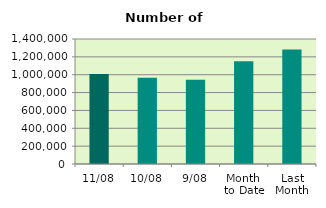
| Category | Series 0 |
|---|---|
| 11/08 | 1008780 |
| 10/08 | 966076 |
| 9/08 | 942592 |
| Month 
to Date | 1149470 |
| Last
Month | 1281605.545 |